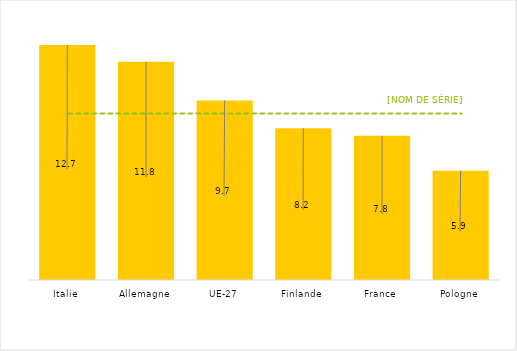
| Category | 2021 |
|---|---|
| Italie | 12.7 |
| Allemagne | 11.8 |
| UE-27 | 9.7 |
| Finlande | 8.2 |
| France | 7.8 |
| Pologne | 5.9 |